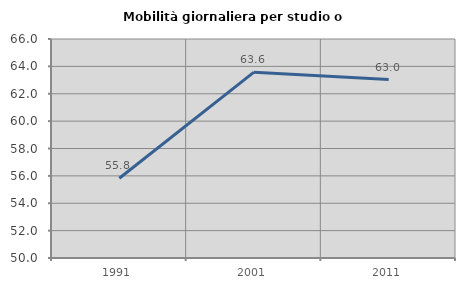
| Category | Mobilità giornaliera per studio o lavoro |
|---|---|
| 1991.0 | 55.823 |
| 2001.0 | 63.577 |
| 2011.0 | 63.032 |